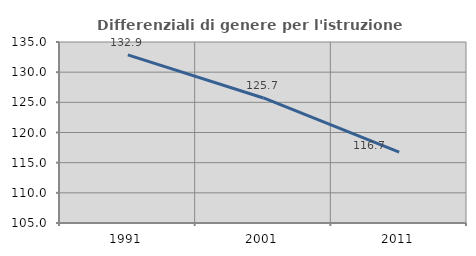
| Category | Differenziali di genere per l'istruzione superiore |
|---|---|
| 1991.0 | 132.876 |
| 2001.0 | 125.723 |
| 2011.0 | 116.742 |